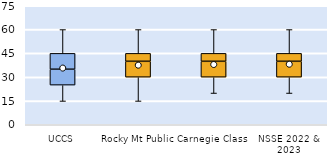
| Category | 25th | 50th | 75th |
|---|---|---|---|
| UCCS | 25 | 10 | 10 |
| Rocky Mt Public | 30 | 10 | 5 |
| Carnegie Class | 30 | 10 | 5 |
| NSSE 2022 & 2023 | 30 | 10 | 5 |